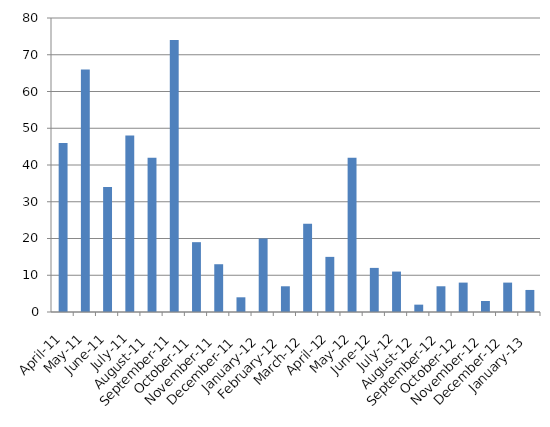
| Category | # |
|---|---|
| 2011-04-01 | 46 |
| 2011-05-02 | 66 |
| 2011-06-02 | 34 |
| 2011-07-02 | 48 |
| 2011-08-02 | 42 |
| 2011-09-02 | 74 |
| 2011-10-02 | 19 |
| 2011-11-02 | 13 |
| 2011-12-02 | 4 |
| 2012-01-02 | 20 |
| 2012-02-02 | 7 |
| 2012-03-02 | 24 |
| 2012-04-02 | 15 |
| 2012-05-02 | 42 |
| 2012-06-02 | 12 |
| 2012-07-02 | 11 |
| 2012-08-02 | 2 |
| 2012-09-02 | 7 |
| 2012-10-02 | 8 |
| 2012-11-02 | 3 |
| 2012-12-02 | 8 |
| 2013-01-02 | 6 |